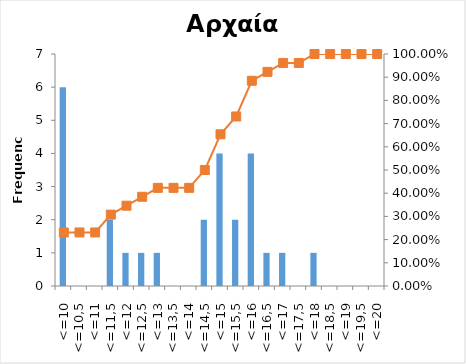
| Category | Series 0 |
|---|---|
| <=10 | 6 |
| <=10,5 | 0 |
| <=11 | 0 |
| <=11,5 | 2 |
| <=12 | 1 |
| <=12,5 | 1 |
| <=13 | 1 |
| <=13,5 | 0 |
| <=14 | 0 |
| <=14,5 | 2 |
| <=15 | 4 |
| <=15,5 | 2 |
| <=16 | 4 |
| <=16,5 | 1 |
| <=17 | 1 |
| <=17,5 | 0 |
| <=18 | 1 |
| <=18,5 | 0 |
| <=19 | 0 |
| <=19,5 | 0 |
| <=20 | 0 |